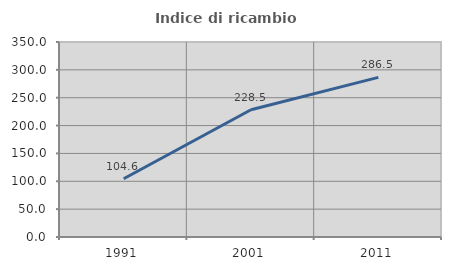
| Category | Indice di ricambio occupazionale  |
|---|---|
| 1991.0 | 104.564 |
| 2001.0 | 228.462 |
| 2011.0 | 286.508 |